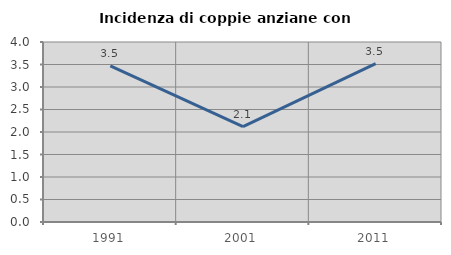
| Category | Incidenza di coppie anziane con figli |
|---|---|
| 1991.0 | 3.47 |
| 2001.0 | 2.121 |
| 2011.0 | 3.519 |